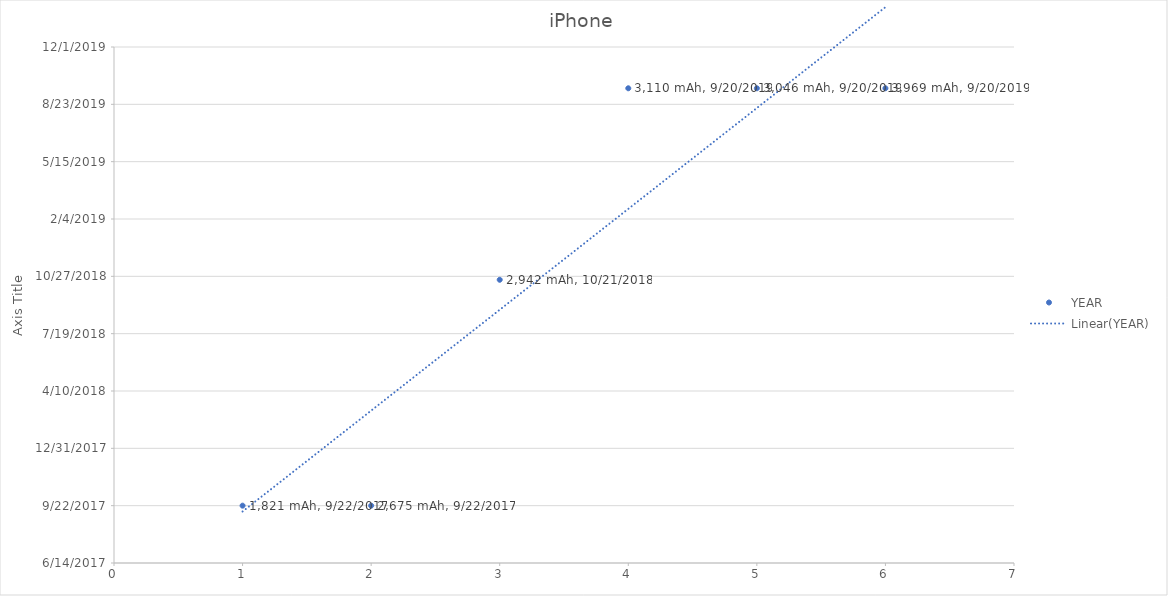
| Category | YEAR |
|---|---|
| 0 | 9/22/17 |
| 1 | 9/22/17 |
| 2 | 10/21/18 |
| 3 | 9/20/19 |
| 4 | 9/20/19 |
| 5 | 9/20/19 |